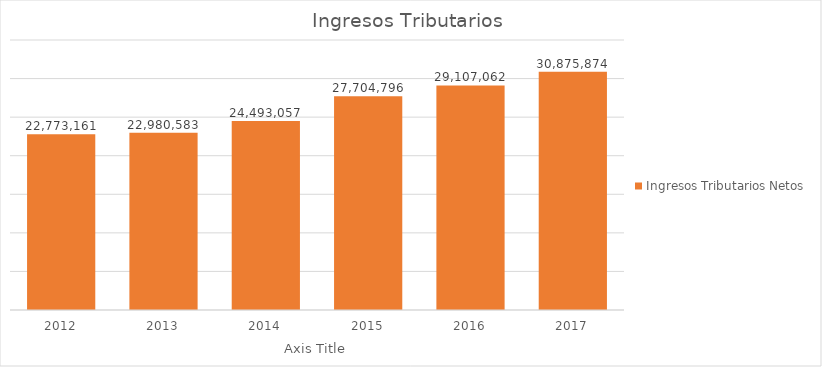
| Category | Ingresos Tributarios Netos |
|---|---|
| 2012.0 | 22773160.755 |
| 2013.0 | 22980583.069 |
| 2014.0 | 24493056.722 |
| 2015.0 | 27704796.201 |
| 2016.0 | 29107061.553 |
| 2017.0 | 30875873.65 |